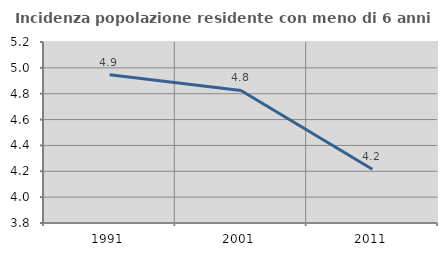
| Category | Incidenza popolazione residente con meno di 6 anni |
|---|---|
| 1991.0 | 4.947 |
| 2001.0 | 4.825 |
| 2011.0 | 4.216 |